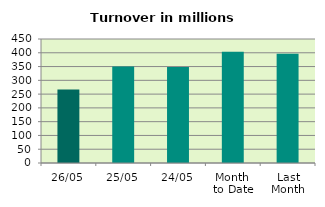
| Category | Series 0 |
|---|---|
| 26/05 | 266.44 |
| 25/05 | 350.244 |
| 24/05 | 348.583 |
| Month 
to Date | 403.636 |
| Last
Month | 396.429 |